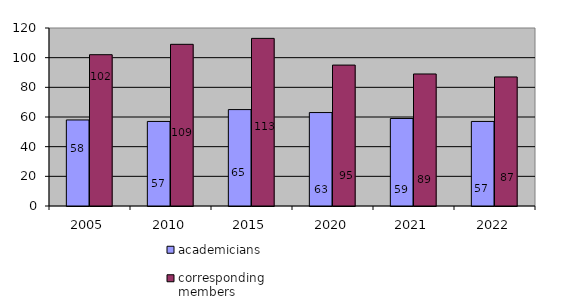
| Category | academicians | corresponding members |
|---|---|---|
| 2005.0 | 58 | 102 |
| 2010.0 | 57 | 109 |
| 2015.0 | 65 | 113 |
| 2020.0 | 63 | 95 |
| 2021.0 | 59 | 89 |
| 2022.0 | 57 | 87 |